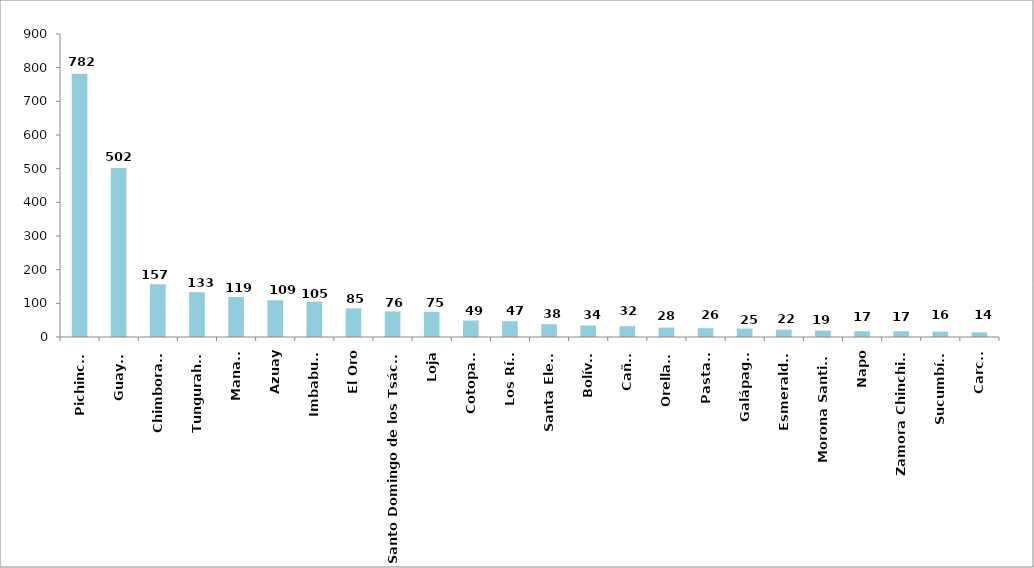
| Category | Series 0 |
|---|---|
| Pichincha | 782 |
| Guayas | 502 |
| Chimborazo | 157 |
| Tungurahua | 133 |
| Manabí | 119 |
| Azuay | 109 |
| Imbabura | 105 |
| El Oro | 85 |
| Santo Domingo de los Tsáchilas | 76 |
| Loja | 75 |
| Cotopaxi | 49 |
| Los Ríos | 47 |
| Santa Elena | 38 |
| Bolívar | 34 |
| Cañar | 32 |
| Orellana | 28 |
| Pastaza | 26 |
| Galápagos | 25 |
| Esmeraldas | 22 |
| Morona Santiago | 19 |
| Napo | 17 |
| Zamora Chinchipe | 17 |
| Sucumbíos | 16 |
| Carchi | 14 |